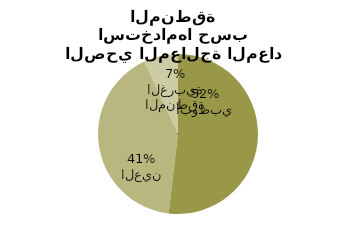
| Category | Series 0 |
|---|---|
| أبوظبي | 65.53 |
| العين | 52.013 |
| المنطقة الغربية | 8.753 |